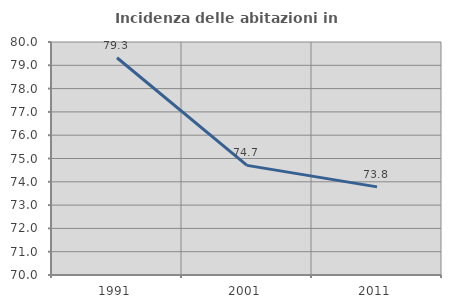
| Category | Incidenza delle abitazioni in proprietà  |
|---|---|
| 1991.0 | 79.324 |
| 2001.0 | 74.705 |
| 2011.0 | 73.782 |